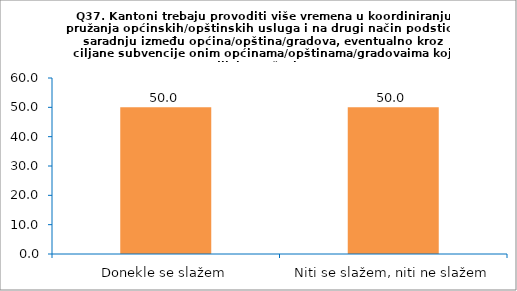
| Category | Series 0 |
|---|---|
| Donekle se slažem | 50 |
| Niti se slažem, niti ne slažem | 50 |